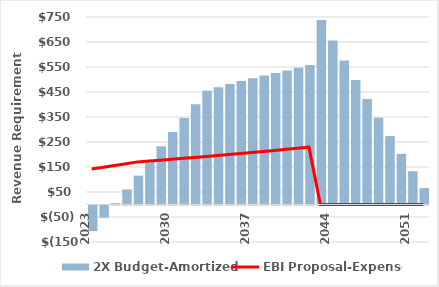
| Category | 2X Budget-Amortized |
|---|---|
| 2023.0 | -102.582 |
| 2024.0 | -48.778 |
| 2025.0 | 5.515 |
| 2026.0 | 60.325 |
| 2027.0 | 115.68 |
| 2028.0 | 174.87 |
| 2029.0 | 233.038 |
| 2030.0 | 290.164 |
| 2031.0 | 346.226 |
| 2032.0 | 401.204 |
| 2033.0 | 455.075 |
| 2034.0 | 469.108 |
| 2035.0 | 482.186 |
| 2036.0 | 494.293 |
| 2037.0 | 505.41 |
| 2038.0 | 515.518 |
| 2039.0 | 525.828 |
| 2040.0 | 536.345 |
| 2041.0 | 547.072 |
| 2042.0 | 558.013 |
| 2043.0 | 737.926 |
| 2044.0 | 656.39 |
| 2045.0 | 576.485 |
| 2046.0 | 498.242 |
| 2047.0 | 421.697 |
| 2048.0 | 346.882 |
| 2049.0 | 273.832 |
| 2050.0 | 202.582 |
| 2051.0 | 133.169 |
| 2052.0 | 65.629 |